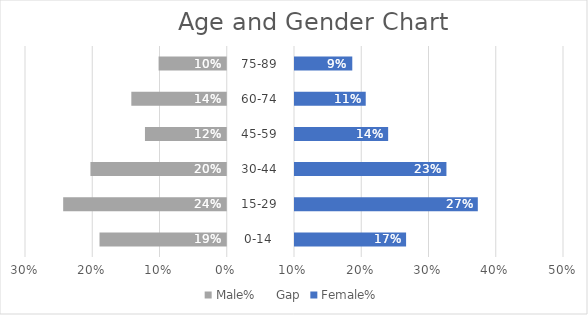
| Category | Male  | Female | Male% | Gap | Female% |
|---|---|---|---|---|---|
| 0-14 |  |  | -0.189 | 0.1 | 0.167 |
| 15-29 |  |  | -0.243 | 0.1 | 0.273 |
| 30-44 |  |  | -0.203 | 0.1 | 0.227 |
| 45-59 |  |  | -0.122 | 0.1 | 0.14 |
| 60-74 |  |  | -0.142 | 0.1 | 0.107 |
| 75-89 |  |  | -0.101 | 0.1 | 0.087 |